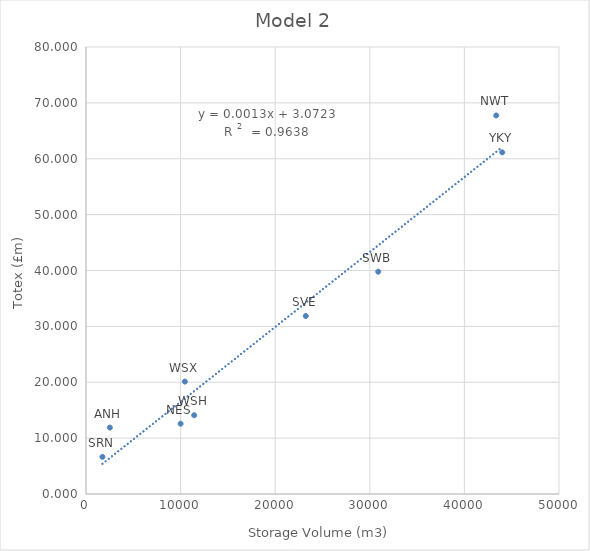
| Category | Series 0 |
|---|---|
| 2522.0 | 11.894 |
| 10000.0 | 12.586 |
| 43360.0 | 67.745 |
| 1740.0 | 6.646 |
| 23234.0 | 31.86 |
| 30889.0 | 39.782 |
| 11436.0 | 14.1 |
| 10450.0 | 20.12 |
| 44000.0 | 61.145 |